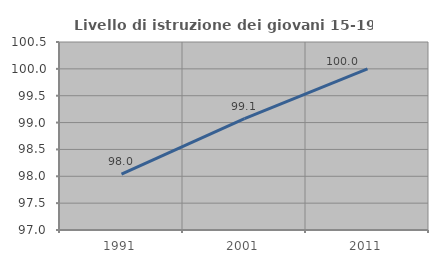
| Category | Livello di istruzione dei giovani 15-19 anni |
|---|---|
| 1991.0 | 98.039 |
| 2001.0 | 99.074 |
| 2011.0 | 100 |